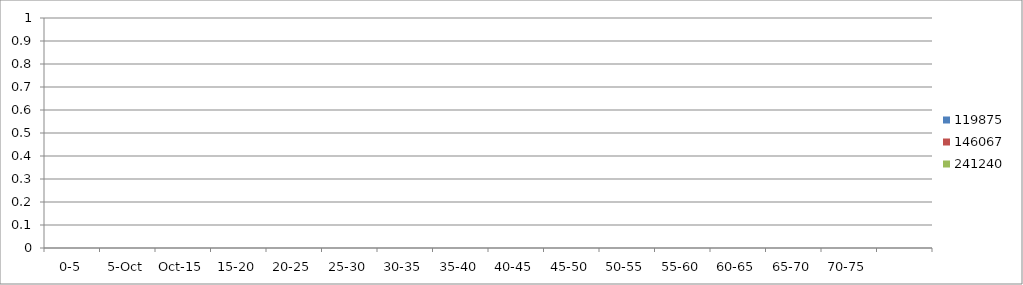
| Category | 119875 | 146067 | 241240 |
|---|---|---|---|
| 0-5 | 0 | 0 | 0 |
| 5.Oct | 0 | 0 | 0 |
| Oct.15 | 0 | 0 | 0 |
| 15-20 | 0 | 0 | 0 |
| 20-25 | 0 | 0 | 0 |
| 25-30 | 0 | 0 | 0 |
| 30-35 | 0 | 0 | 0 |
| 35-40 | 0 | 0 | 0 |
| 40-45 | 0 | 0 | 0 |
| 45-50 | 0 | 0 | 0 |
| 50-55 | 0 | 0 | 0 |
| 55-60 | 0 | 0 | 0 |
| 60-65 | 0 | 0 | 0 |
| 65-70 | 0 | 0 | 0 |
| 70-75 | 0 | 0 | 0 |